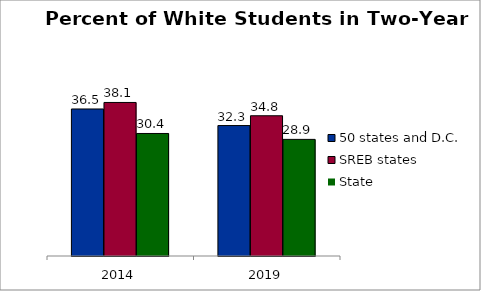
| Category | 50 states and D.C. | SREB states | State |
|---|---|---|---|
| 2014.0 | 36.45 | 38.068 | 30.38 |
| 2019.0 | 32.341 | 34.771 | 28.913 |